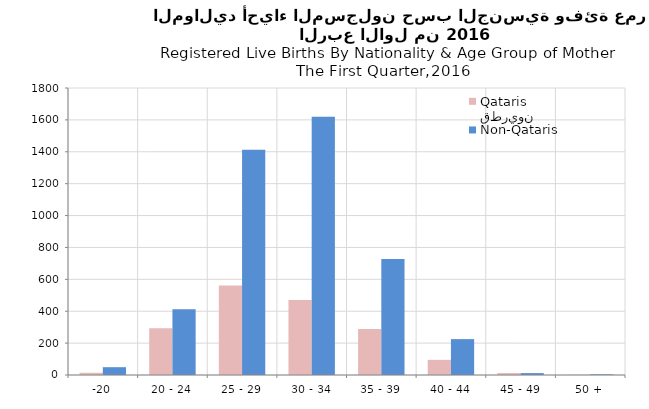
| Category | قطريون
Qataris | غير قطريين
Non-Qataris |
|---|---|---|
| -20 | 14 | 49 |
| 20 - 24 | 293 | 413 |
| 25 - 29 | 561 | 1413 |
| 30 - 34 | 471 | 1620 |
| 35 - 39 | 288 | 728 |
| 40 - 44 | 95 | 225 |
| 45 - 49 | 12 | 12 |
| 50 + | 1 | 4 |